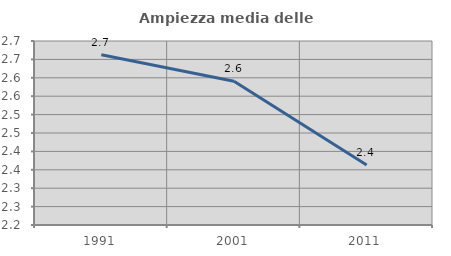
| Category | Ampiezza media delle famiglie |
|---|---|
| 1991.0 | 2.662 |
| 2001.0 | 2.59 |
| 2011.0 | 2.363 |